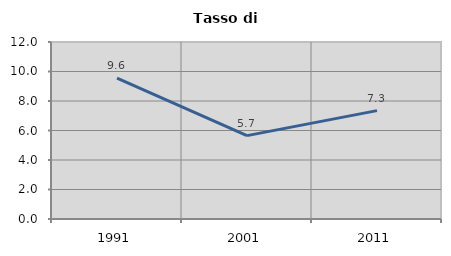
| Category | Tasso di disoccupazione   |
|---|---|
| 1991.0 | 9.556 |
| 2001.0 | 5.654 |
| 2011.0 | 7.347 |